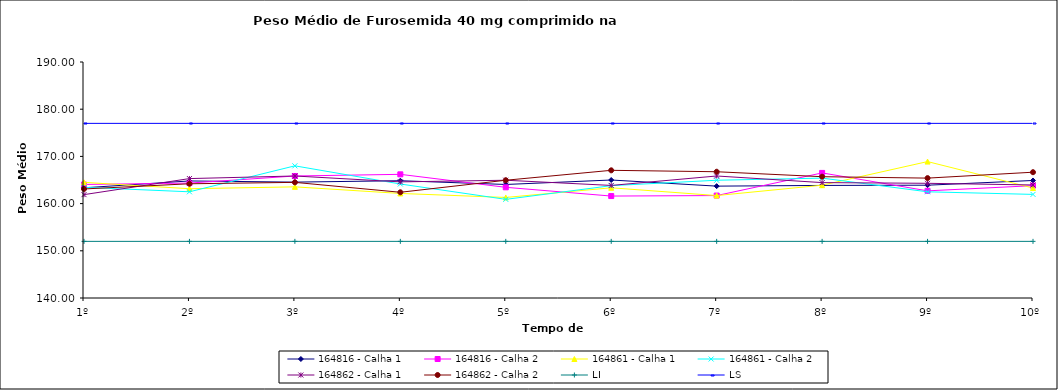
| Category | 164816 - Calha 1 | 164816 - Calha 2 | 164861 - Calha 1 | 164861 - Calha 2 | 164862 - Calha 1 | 164862 - Calha 2 | LI | LS |
|---|---|---|---|---|---|---|---|---|
| 1º | 163.35 | 164.05 | 164.5 | 163.45 | 161.9 | 163.1 | 152 | 177 |
| 2º | 164.8 | 164.35 | 163.15 | 162.5 | 165.3 | 164.2 | 152 | 177 |
| 3º | 164.55 | 165.85 | 163.55 | 168 | 165.85 | 164.5 | 152 | 177 |
| 4º | 164.85 | 166.2 | 162.15 | 164.15 | 164.6 | 162.4 | 152 | 177 |
| 5º | 164.05 | 163.45 | 161.3 | 160.9 | 164.95 | 164.95 | 152 | 177 |
| 6º | 165 | 161.6 | 163.35 | 163.8 | 163.85 | 167.05 | 152 | 177 |
| 7º | 163.7 | 161.7 | 161.7 | 164.95 | 165.85 | 166.75 | 152 | 177 |
| 8º | 163.85 | 166.5 | 163.9 | 165.4 | 164.45 | 165.7 | 152 | 177 |
| 9º | 163.9 | 162.7 | 168.9 | 162.5 | 164.3 | 165.4 | 152 | 177 |
| 10º | 164.9 | 163.8 | 163.3 | 161.95 | 163.95 | 166.65 | 152 | 177 |